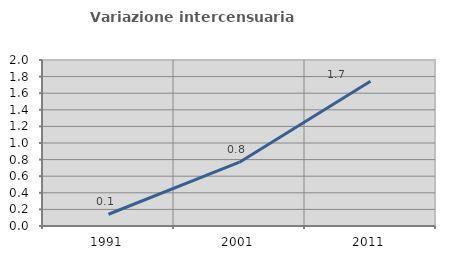
| Category | Variazione intercensuaria annua |
|---|---|
| 1991.0 | 0.142 |
| 2001.0 | 0.769 |
| 2011.0 | 1.744 |